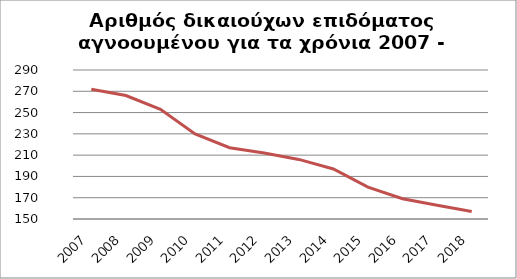
| Category | Series 1 |
|---|---|
| 2007.0 | 272 |
| 2008.0 | 266 |
| 2009.0 | 253 |
| 2010.0 | 230 |
| 2011.0 | 217 |
| 2012.0 | 212 |
| 2013.0 | 206 |
| 2014.0 | 197 |
| 2015.0 | 180 |
| 2016.0 | 169 |
| 2017.0 | 163 |
| 2018.0 | 157 |